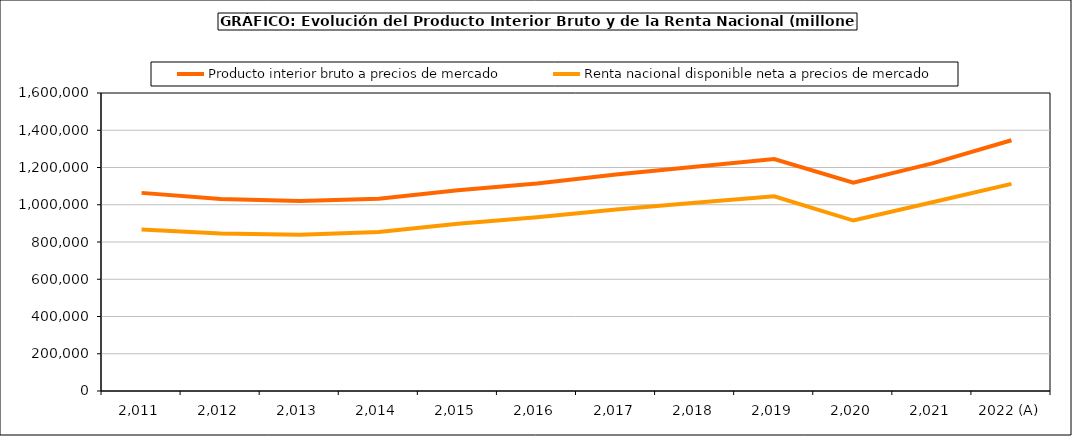
| Category | Producto interior bruto a precios de mercado | Renta nacional disponible neta a precios de mercado |
|---|---|---|
| 2.011 | 1063763 | 867238 |
| 2.012 | 1031104 | 845978 |
| 2.013 | 1020677 | 838823 |
| 2.014 | 1032608 | 853672 |
| 2.015 | 1078092 | 898462 |
| 2.016 | 1114420 | 932732 |
| 2.017 | 1162492 | 974735 |
| 2.018 | 1203859 | 1010438 |
| 2.019 | 1245513 | 1045452 |
| 2.020 | 1119010 | 915159 |
| 2.021 | 1222290 | 1013305 |
| 2022 (A) | 1346377 | 1112187 |